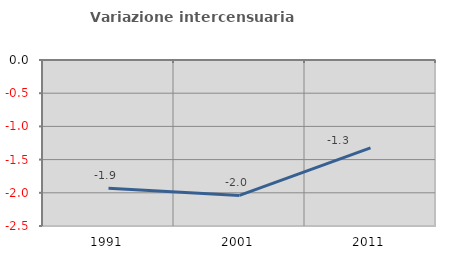
| Category | Variazione intercensuaria annua |
|---|---|
| 1991.0 | -1.931 |
| 2001.0 | -2.04 |
| 2011.0 | -1.324 |